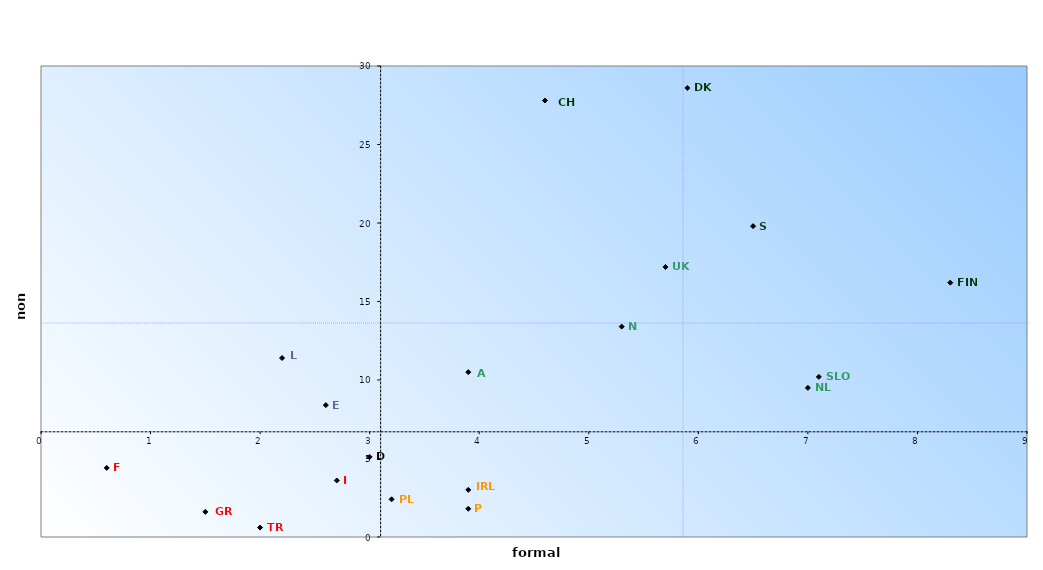
| Category | Series 1 |
|---|---|
| 0.6 | 4.4 |
| 1.5 | 1.6 |
| 2.0 | 0.6 |
| 2.6 | 8.4 |
| 2.7 | 3.6 |
| 3.0 | 5.1 |
| 3.2 | 2.4 |
| 3.9 | 1.8 |
| 5.3 | 13.4 |
| 5.7 | 17.2 |
| 5.9 | 28.6 |
| 6.5 | 19.8 |
| 7.0 | 9.5 |
| 7.1 | 10.2 |
| 8.3 | 16.2 |
| 4.6 | 27.8 |
| 2.2 | 11.4 |
| 3.9 | 10.5 |
| 3.9 | 3 |